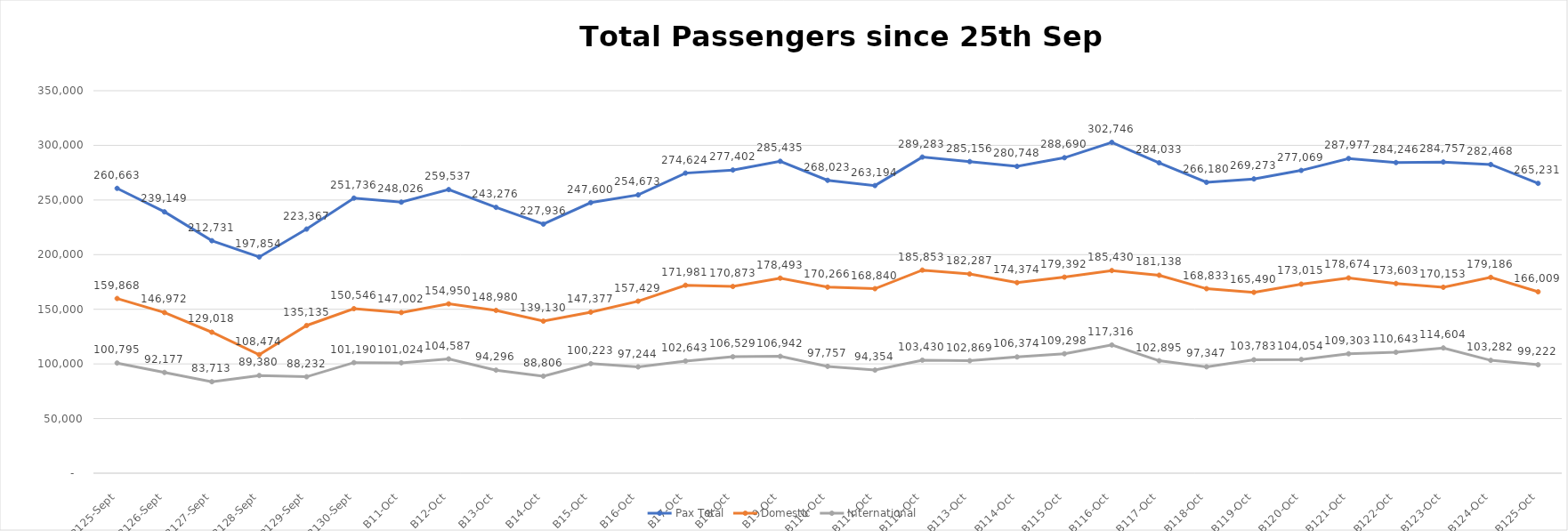
| Category | Pax Total |  Domestic  |  International  |
|---|---|---|---|
| 2022-09-25 | 260663 | 159868 | 100795 |
| 2022-09-26 | 239149 | 146972 | 92177 |
| 2022-09-27 | 212731 | 129018 | 83713 |
| 2022-09-28 | 197854 | 108474 | 89380 |
| 2022-09-29 | 223367 | 135135 | 88232 |
| 2022-09-30 | 251736 | 150546 | 101190 |
| 2022-10-01 | 248026 | 147002 | 101024 |
| 2022-10-02 | 259537 | 154950 | 104587 |
| 2022-10-03 | 243276 | 148980 | 94296 |
| 2022-10-04 | 227936 | 139130 | 88806 |
| 2022-10-05 | 247600 | 147377 | 100223 |
| 2022-10-06 | 254673 | 157429 | 97244 |
| 2022-10-07 | 274624 | 171981 | 102643 |
| 2022-10-08 | 277402 | 170873 | 106529 |
| 2022-10-09 | 285435 | 178493 | 106942 |
| 2022-10-10 | 268023 | 170266 | 97757 |
| 2022-10-11 | 263194 | 168840 | 94354 |
| 2022-10-12 | 289283 | 185853 | 103430 |
| 2022-10-13 | 285156 | 182287 | 102869 |
| 2022-10-14 | 280748 | 174374 | 106374 |
| 2022-10-15 | 288690 | 179392 | 109298 |
| 2022-10-16 | 302746 | 185430 | 117316 |
| 2022-10-17 | 284033 | 181138 | 102895 |
| 2022-10-18 | 266180 | 168833 | 97347 |
| 2022-10-19 | 269273 | 165490 | 103783 |
| 2022-10-20 | 277069 | 173015 | 104054 |
| 2022-10-21 | 287977 | 178674 | 109303 |
| 2022-10-22 | 284246 | 173603 | 110643 |
| 2022-10-23 | 284757 | 170153 | 114604 |
| 2022-10-24 | 282468 | 179186 | 103282 |
| 2022-10-25 | 265231 | 166009 | 99222 |